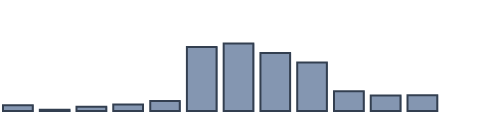
| Category | Series 0 |
|---|---|
| 0 | 1.837 |
| 1 | 0.42 |
| 2 | 1.351 |
| 3 | 2.064 |
| 4 | 3.116 |
| 5 | 20.146 |
| 6 | 21.319 |
| 7 | 18.308 |
| 8 | 15.296 |
| 9 | 6.253 |
| 10 | 4.901 |
| 11 | 4.989 |
| 12 | 0 |